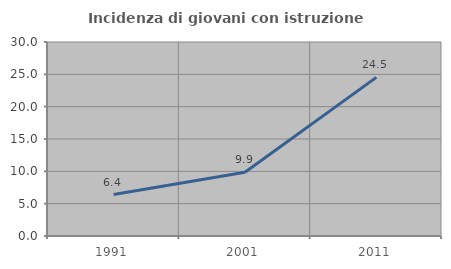
| Category | Incidenza di giovani con istruzione universitaria |
|---|---|
| 1991.0 | 6.402 |
| 2001.0 | 9.859 |
| 2011.0 | 24.525 |